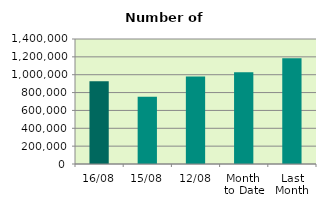
| Category | Series 0 |
|---|---|
| 16/08 | 926758 |
| 15/08 | 754358 |
| 12/08 | 981144 |
| Month 
to Date | 1028896 |
| Last
Month | 1183989.81 |